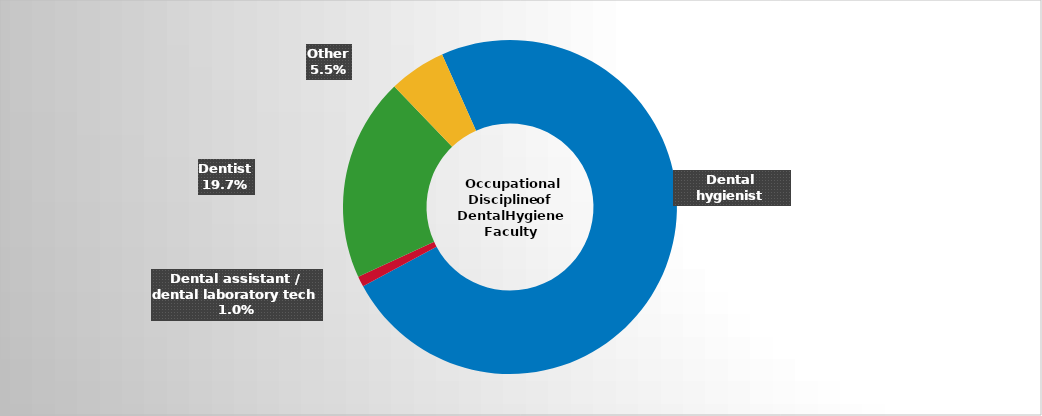
| Category | Series 2 |
|---|---|
| Dental hygienist | 0.738 |
| Dental assistant / dental laboratory tech | 0.01 |
| Dentist | 0.197 |
| Other | 0.055 |